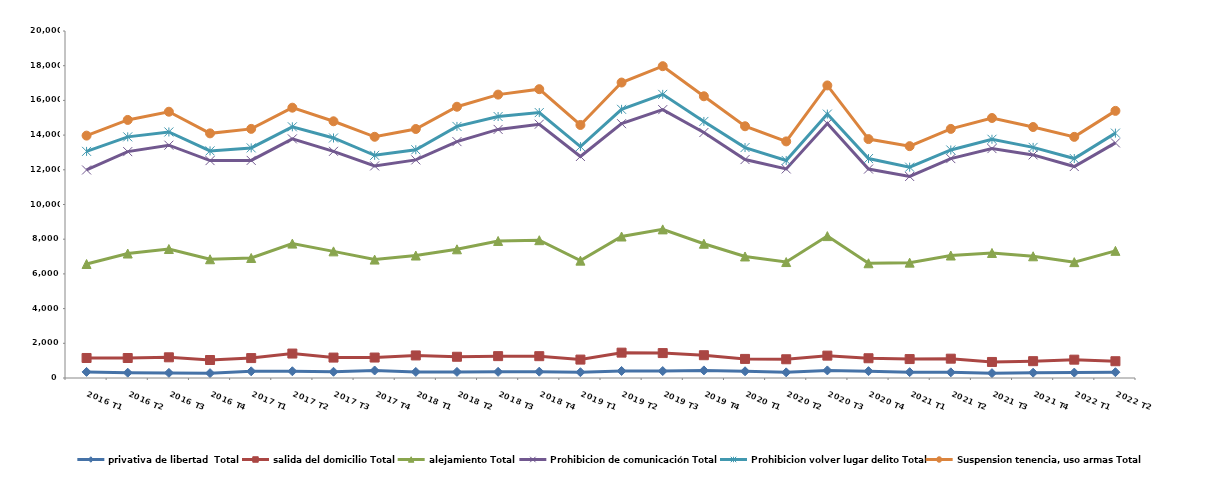
| Category | privativa de libertad  Total | salida del domicilio Total | alejamiento Total | Prohibicion de comunicación Total | Prohibicion volver lugar delito Total | Suspension tenencia, uso armas Total |
|---|---|---|---|---|---|---|
| 2016 T1 | 351 | 803 | 5416 | 5420 | 1072 | 908 |
| 2016 T2 | 306 | 846 | 6022 | 5873 | 852 | 975 |
| 2016 T3 | 295 | 898 | 6241 | 5985 | 762 | 1166 |
| 2016 T4 | 280 | 757 | 5807 | 5686 | 560 | 1010 |
| 2017 T1 | 385 | 763 | 5769 | 5625 | 720 | 1097 |
| 2017 T2 | 389 | 1020 | 6337 | 6036 | 695 | 1103 |
| 2017 T3 | 360 | 817 | 6122 | 5765 | 770 | 963 |
| 2017 T4 | 432 | 747 | 5646 | 5399 | 610 | 1069 |
| 2018 T1 | 350 | 950 | 5758 | 5513 | 585 | 1196 |
| 2018 T2 | 352 | 872 | 6194 | 6206 | 877 | 1133 |
| 2018 T3 | 354 | 906 | 6638 | 6430 | 743 | 1263 |
| 2018 T4 | 364 | 894 | 6685 | 6685 | 670 | 1349 |
| 2019 T1 | 334 | 727 | 5704 | 6003 | 573 | 1243 |
| 2019 T2 | 406 | 1055 | 6694 | 6504 | 827 | 1543 |
| 2019 T3 | 401 | 1035 | 7130 | 6902 | 880 | 1624 |
| 2019 T4 | 437 | 876 | 6426 | 6409 | 640 | 1450 |
| 2020 T1 | 387 | 713 | 5904 | 5586 | 692 | 1228 |
| 2020 T2 | 325 | 755 | 5603 | 5367 | 488 | 1099 |
| 2020 T3 | 437 | 852 | 6890 | 6487 | 545 | 1652 |
| 2020 T4 | 395 | 744 | 5474 | 5429 | 606 | 1122 |
| 2021 T1 | 336 | 755 | 5558 | 4967 | 536 | 1211 |
| 2021 T2 | 326 | 788 | 5945 | 5586 | 497 | 1215 |
| 2021 T3 | 279 | 645 | 6283 | 6015 | 538 | 1226 |
| 2021 T4 | 306 | 664 | 6045 | 5843 | 435 | 1173 |
| 2022 T1 | 313 | 744 | 5621 | 5510 | 462 | 1249 |
| 2022 T2 | 335 | 632 | 6361 | 6222 | 564 | 1282 |